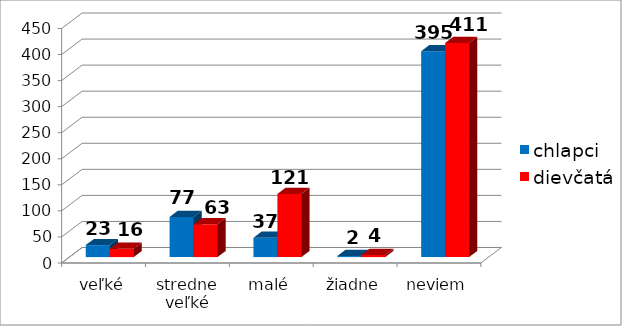
| Category | chlapci | dievčatá |
|---|---|---|
| veľké | 23 | 16 |
| stredne veľké | 77 | 63 |
| malé | 37 | 121 |
| žiadne | 2 | 4 |
| neviem | 395 | 411 |